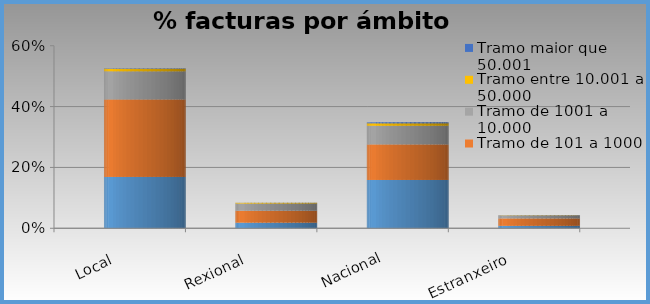
| Category | Tramo  de 0 a 100 € | Tramo de 101 a 1000 | Tramo de 1001 a 10.000 | Tramo entre 10.001 a 50.000 | Tramo maior que 50.001 |
|---|---|---|---|---|---|
| Local | 0.169 | 0.255 | 0.092 | 0.008 | 0.001 |
| Rexional | 0.018 | 0.039 | 0.024 | 0.002 | 0 |
| Nacional | 0.159 | 0.117 | 0.061 | 0.008 | 0.003 |
| Estranxeiro | 0.008 | 0.025 | 0.01 | 0 | 0 |